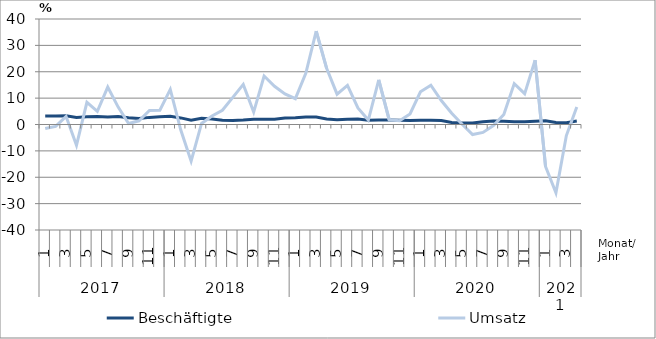
| Category | Beschäftigte | Umsatz |
|---|---|---|
| 0 | 3.2 | -1.5 |
| 1 | 3.2 | -0.7 |
| 2 | 3.3 | 3.1 |
| 3 | 2.7 | -7.9 |
| 4 | 2.9 | 8.4 |
| 5 | 3 | 5 |
| 6 | 2.8 | 14.2 |
| 7 | 3 | 6.6 |
| 8 | 2.6 | 0.4 |
| 9 | 2.3 | 1.4 |
| 10 | 2.7 | 5.3 |
| 11 | 2.9 | 5.4 |
| 12 | 3.1 | 13.3 |
| 13 | 2.5 | -2 |
| 14 | 1.6 | -13.9 |
| 15 | 2.4 | 0.4 |
| 16 | 2.1 | 3.2 |
| 17 | 1.6 | 5.4 |
| 18 | 1.5 | 10.3 |
| 19 | 1.7 | 15.2 |
| 20 | 2 | 4.7 |
| 21 | 2 | 18.4 |
| 22 | 2 | 14.5 |
| 23 | 2.5 | 11.6 |
| 24 | 2.6 | 9.8 |
| 25 | 2.8 | 19.4 |
| 26 | 2.8 | 35.4 |
| 27 | 2.1 | 21.3 |
| 28 | 1.8 | 11.5 |
| 29 | 2 | 14.8 |
| 30 | 2.1 | 6.3 |
| 31 | 1.6 | 1.7 |
| 32 | 1.7 | 16.9 |
| 33 | 1.7 | 1.8 |
| 34 | 1.6 | 1.4 |
| 35 | 1.5 | 4 |
| 36 | 1.6 | 12.4 |
| 37 | 1.6 | 14.9 |
| 38 | 1.5 | 9.1 |
| 39 | 0.8 | 4.3 |
| 40 | 0.6 | 0.1 |
| 41 | 0.6 | -3.8 |
| 42 | 1 | -3 |
| 43 | 1.3 | -0.4 |
| 44 | 1.2 | 3.8 |
| 45 | 1 | 15.5 |
| 46 | 1 | 11.7 |
| 47 | 1.2 | 24.4 |
| 48 | 1.4 | -15.9 |
| 49 | 0.8 | -25.9 |
| 50 | 0.7 | -4.2 |
| 51 | 1.3 | 6.6 |